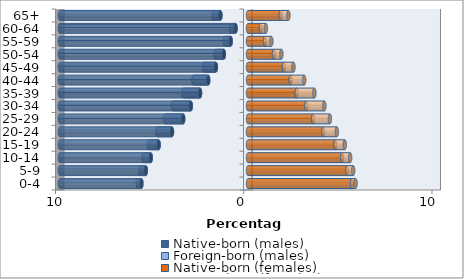
| Category | Native-born (males) | Foreign-born (males) | Native-born (females) | Foreign-born (females) |
|---|---|---|---|---|
| 0-4 | -5.662 | -0.192 | 5.528 | 0.186 |
| 5-9 | -5.43 | -0.298 | 5.272 | 0.315 |
| 10-14 | -5.166 | -0.391 | 5.007 | 0.421 |
| 15-19 | -4.746 | -0.506 | 4.636 | 0.505 |
| 20-24 | -4.039 | -0.774 | 3.999 | 0.719 |
| 25-29 | -3.441 | -0.951 | 3.459 | 0.892 |
| 30-34 | -3.037 | -0.962 | 3.089 | 0.967 |
| 35-39 | -2.547 | -0.887 | 2.585 | 0.942 |
| 40-44 | -2.113 | -0.788 | 2.269 | 0.719 |
| 45-49 | -1.707 | -0.628 | 1.907 | 0.508 |
| 50-54 | -1.283 | -0.45 | 1.381 | 0.394 |
| 55-59 | -0.92 | -0.313 | 0.904 | 0.339 |
| 60-64 | -0.66 | -0.241 | 0.682 | 0.269 |
| 65+ | -1.465 | -0.356 | 1.739 | 0.409 |